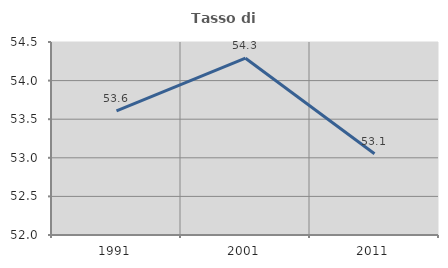
| Category | Tasso di occupazione   |
|---|---|
| 1991.0 | 53.607 |
| 2001.0 | 54.29 |
| 2011.0 | 53.052 |